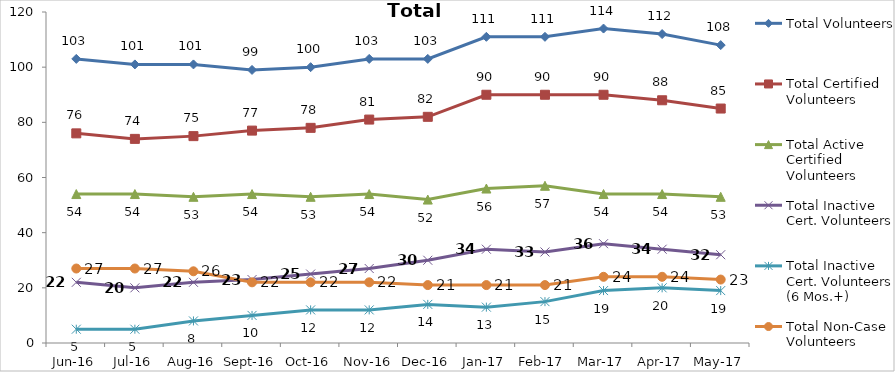
| Category | Total Volunteers | Total Certified Volunteers | Total Active Certified Volunteers | Total Inactive Cert. Volunteers | Total Inactive Cert. Volunteers (6 Mos.+) | Total Non-Case Volunteers |
|---|---|---|---|---|---|---|
| Jun-16 | 103 | 76 | 54 | 22 | 5 | 27 |
| Jul-16 | 101 | 74 | 54 | 20 | 5 | 27 |
| Aug-16 | 101 | 75 | 53 | 22 | 8 | 26 |
| Sep-16 | 99 | 77 | 54 | 23 | 10 | 22 |
| Oct-16 | 100 | 78 | 53 | 25 | 12 | 22 |
| Nov-16 | 103 | 81 | 54 | 27 | 12 | 22 |
| Dec-16 | 103 | 82 | 52 | 30 | 14 | 21 |
| Jan-17 | 111 | 90 | 56 | 34 | 13 | 21 |
| Feb-17 | 111 | 90 | 57 | 33 | 15 | 21 |
| Mar-17 | 114 | 90 | 54 | 36 | 19 | 24 |
| Apr-17 | 112 | 88 | 54 | 34 | 20 | 24 |
| May-17 | 108 | 85 | 53 | 32 | 19 | 23 |